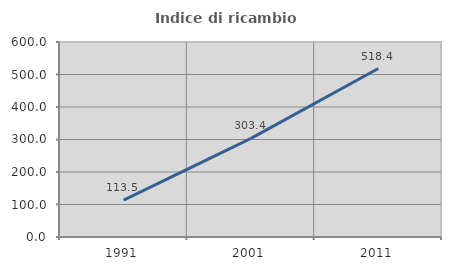
| Category | Indice di ricambio occupazionale  |
|---|---|
| 1991.0 | 113.475 |
| 2001.0 | 303.39 |
| 2011.0 | 518.367 |